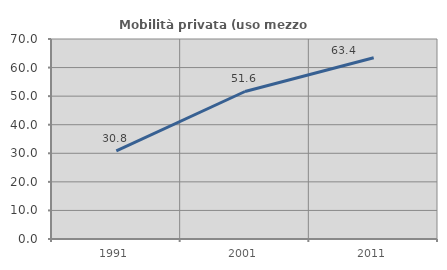
| Category | Mobilità privata (uso mezzo privato) |
|---|---|
| 1991.0 | 30.825 |
| 2001.0 | 51.628 |
| 2011.0 | 63.431 |